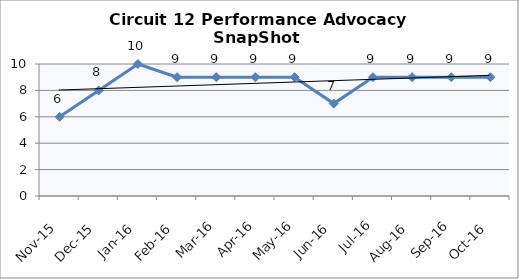
| Category | Circuit 12 |
|---|---|
| Nov-15 | 6 |
| Dec-15 | 8 |
| Jan-16 | 10 |
| Feb-16 | 9 |
| Mar-16 | 9 |
| Apr-16 | 9 |
| May-16 | 9 |
| Jun-16 | 7 |
| Jul-16 | 9 |
| Aug-16 | 9 |
| Sep-16 | 9 |
| Oct-16 | 9 |